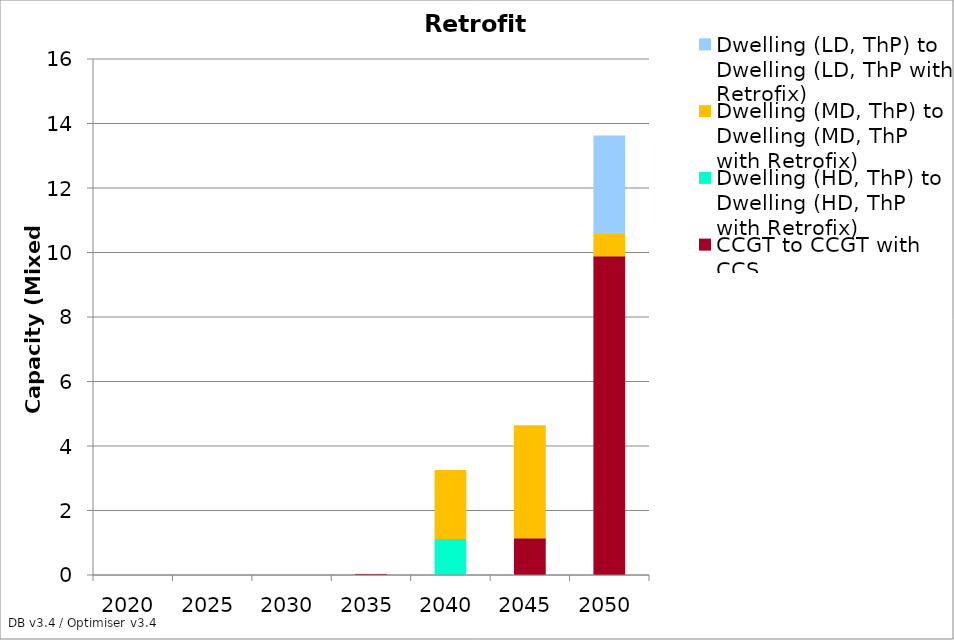
| Category | Dwelling (LD, ThP) to Dwelling (HD, ThM) | CCGT to CCGT with CCS | Dwelling (HD, ThP) to Dwelling (HD, ThP with Retrofix) | Dwelling (MD, ThP) to Dwelling (MD, ThP with Retrofix) | Dwelling (LD, ThP) to Dwelling (LD, ThP with Retrofix) |
|---|---|---|---|---|---|
| 2020.0 | 0 | 0 | 0 | 0 | 0 |
| 2025.0 | 0.001 | 0 | 0 | 0 | 0 |
| 2030.0 | 0.002 | 0 | 0 | 0 | 0 |
| 2035.0 | 0.003 | 0.031 | 0 | 0 | 0 |
| 2040.0 | 0.007 | 0 | 1.11 | 2.14 | 0 |
| 2045.0 | 0.003 | 1.139 | 0 | 3.5 | 0 |
| 2050.0 | 0.004 | 9.876 | 0 | 0.697 | 3.053 |